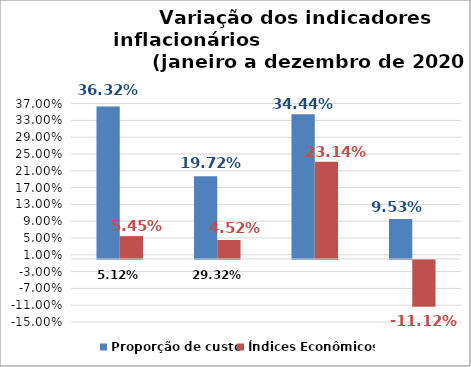
| Category | Proporção de custo | Índices Econômicos |
|---|---|---|
| 0.05119500714056782 | 0.363 | 0.054 |
| 0.2931843248711377 | 0.197 | 0.045 |